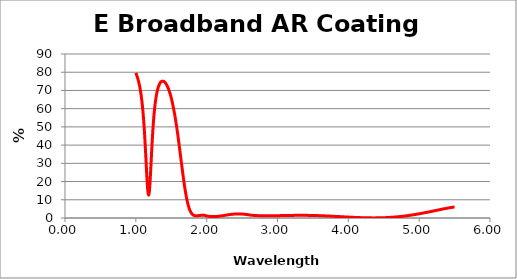
| Category | % Reflectance |
|---|---|
| 1.0 | 79.653 |
| 1.01 | 78.657 |
| 1.02 | 77.485 |
| 1.03 | 76.175 |
| 1.04 | 74.678 |
| 1.05 | 72.986 |
| 1.06 | 71.047 |
| 1.07 | 68.699 |
| 1.08 | 65.851 |
| 1.09 | 62.562 |
| 1.1 | 58.677 |
| 1.11 | 53.922 |
| 1.12 | 48.224 |
| 1.13 | 41.711 |
| 1.14 | 34.492 |
| 1.15 | 26.817 |
| 1.16 | 19.688 |
| 1.17 | 14.561 |
| 1.18 | 12.553 |
| 1.19 | 14.259 |
| 1.2 | 19.355 |
| 1.21 | 26.324 |
| 1.22 | 33.88 |
| 1.23 | 41.33 |
| 1.24 | 48.011 |
| 1.25 | 53.501 |
| 1.26 | 57.996 |
| 1.27 | 61.789 |
| 1.28 | 64.864 |
| 1.29 | 67.294 |
| 1.3 | 69.262 |
| 1.31 | 70.872 |
| 1.32 | 72.177 |
| 1.33 | 73.156 |
| 1.34 | 73.915 |
| 1.35 | 74.528 |
| 1.36 | 74.879 |
| 1.37 | 75.066 |
| 1.38 | 75.109 |
| 1.39 | 75.038 |
| 1.4 | 74.818 |
| 1.41 | 74.485 |
| 1.42 | 73.993 |
| 1.43 | 73.386 |
| 1.44 | 72.67 |
| 1.45 | 71.869 |
| 1.46 | 70.949 |
| 1.47 | 69.88 |
| 1.48 | 68.674 |
| 1.49 | 67.367 |
| 1.5 | 65.919 |
| 1.51 | 64.318 |
| 1.52 | 62.536 |
| 1.53 | 60.657 |
| 1.54 | 58.643 |
| 1.55 | 56.442 |
| 1.56 | 54.102 |
| 1.57 | 51.677 |
| 1.58 | 49.114 |
| 1.59 | 46.339 |
| 1.6 | 43.442 |
| 1.61 | 40.507 |
| 1.62 | 37.537 |
| 1.63 | 34.468 |
| 1.64 | 31.357 |
| 1.65 | 28.348 |
| 1.66 | 25.364 |
| 1.67 | 22.424 |
| 1.68 | 19.594 |
| 1.69 | 16.968 |
| 1.7 | 14.552 |
| 1.71 | 12.301 |
| 1.72 | 10.273 |
| 1.73 | 8.523 |
| 1.74 | 6.99 |
| 1.75 | 5.687 |
| 1.76 | 4.561 |
| 1.77 | 3.661 |
| 1.78 | 2.944 |
| 1.79 | 2.389 |
| 1.8 | 1.968 |
| 1.81 | 1.66 |
| 1.82 | 1.428 |
| 1.83 | 1.306 |
| 1.84 | 1.231 |
| 1.85 | 1.19 |
| 1.86 | 1.192 |
| 1.87 | 1.215 |
| 1.88 | 1.266 |
| 1.89 | 1.31 |
| 1.9 | 1.377 |
| 1.91 | 1.423 |
| 1.92 | 1.452 |
| 1.93 | 1.46 |
| 1.94 | 1.492 |
| 1.95 | 1.529 |
| 1.96 | 1.54 |
| 1.97 | 1.444 |
| 1.98 | 1.346 |
| 1.99 | 1.24 |
| 2.00007 | 1.158 |
| 2.00994 | 1.072 |
| 2.01982 | 0.997 |
| 2.02997 | 0.931 |
| 2.03984 | 0.878 |
| 2.04998 | 0.834 |
| 2.05984 | 0.8 |
| 2.0697 | 0.776 |
| 2.07984 | 0.76 |
| 2.08969 | 0.754 |
| 2.09982 | 0.755 |
| 2.10967 | 0.764 |
| 2.11979 | 0.78 |
| 2.12963 | 0.803 |
| 2.13947 | 0.832 |
| 2.14958 | 0.867 |
| 2.15941 | 0.907 |
| 2.16952 | 0.952 |
| 2.17962 | 1.002 |
| 2.18944 | 1.054 |
| 2.19954 | 1.111 |
| 2.20935 | 1.169 |
| 2.21944 | 1.23 |
| 2.22925 | 1.292 |
| 2.23933 | 1.356 |
| 2.24941 | 1.421 |
| 2.25921 | 1.485 |
| 2.26928 | 1.55 |
| 2.27907 | 1.612 |
| 2.28914 | 1.676 |
| 2.2992 | 1.737 |
| 2.30926 | 1.797 |
| 2.31903 | 1.852 |
| 2.32908 | 1.906 |
| 2.33913 | 1.957 |
| 2.3489 | 2.004 |
| 2.35894 | 2.048 |
| 2.36897 | 2.088 |
| 2.379 | 2.123 |
| 2.38875 | 2.153 |
| 2.39878 | 2.18 |
| 2.4088 | 2.201 |
| 2.41882 | 2.218 |
| 2.42883 | 2.229 |
| 2.43884 | 2.236 |
| 2.44885 | 2.237 |
| 2.45857 | 2.233 |
| 2.46857 | 2.224 |
| 2.47857 | 2.21 |
| 2.48856 | 2.192 |
| 2.49854 | 2.168 |
| 2.50853 | 2.141 |
| 2.51851 | 2.109 |
| 2.52848 | 2.073 |
| 2.53845 | 2.035 |
| 2.54842 | 1.993 |
| 2.55838 | 1.949 |
| 2.56834 | 1.903 |
| 2.57829 | 1.856 |
| 2.58825 | 1.808 |
| 2.59819 | 1.76 |
| 2.60813 | 1.62 |
| 2.61835 | 1.579 |
| 2.62828 | 1.542 |
| 2.63821 | 1.507 |
| 2.64814 | 1.475 |
| 2.65806 | 1.444 |
| 2.66798 | 1.416 |
| 2.67817 | 1.39 |
| 2.68808 | 1.366 |
| 2.69798 | 1.344 |
| 2.70788 | 1.324 |
| 2.71805 | 1.306 |
| 2.72794 | 1.289 |
| 2.73783 | 1.274 |
| 2.74799 | 1.261 |
| 2.75787 | 1.249 |
| 2.76774 | 1.239 |
| 2.77788 | 1.23 |
| 2.78775 | 1.222 |
| 2.79761 | 1.216 |
| 2.80774 | 1.211 |
| 2.81759 | 1.207 |
| 2.82771 | 1.204 |
| 2.83756 | 1.202 |
| 2.84767 | 1.201 |
| 2.8575 | 1.201 |
| 2.8676 | 1.202 |
| 2.87743 | 1.203 |
| 2.88752 | 1.206 |
| 2.89734 | 1.209 |
| 2.90742 | 1.213 |
| 2.9175 | 1.217 |
| 2.9273 | 1.222 |
| 2.93737 | 1.227 |
| 2.94716 | 1.233 |
| 2.95722 | 1.239 |
| 2.96728 | 1.246 |
| 2.97732 | 1.253 |
| 2.9871 | 1.26 |
| 2.99714 | 1.268 |
| 3.00717 | 1.276 |
| 3.0172 | 1.284 |
| 3.02695 | 1.292 |
| 3.03697 | 1.3 |
| 3.04699 | 1.308 |
| 3.057 | 1.316 |
| 3.067 | 1.325 |
| 3.077 | 1.333 |
| 3.087 | 1.341 |
| 3.09698 | 1.35 |
| 3.10697 | 1.358 |
| 3.11668 | 1.365 |
| 3.12665 | 1.373 |
| 3.13662 | 1.381 |
| 3.14685 | 1.388 |
| 3.15681 | 1.395 |
| 3.16676 | 1.402 |
| 3.17671 | 1.409 |
| 3.18665 | 1.415 |
| 3.19659 | 1.421 |
| 3.20652 | 1.427 |
| 3.21644 | 1.432 |
| 3.22636 | 1.437 |
| 3.23655 | 1.441 |
| 3.24646 | 1.445 |
| 3.25636 | 1.449 |
| 3.26626 | 1.452 |
| 3.27642 | 1.455 |
| 3.28631 | 1.458 |
| 3.29619 | 1.46 |
| 3.30633 | 1.461 |
| 3.3162 | 1.462 |
| 3.32633 | 1.463 |
| 3.33619 | 1.463 |
| 3.34605 | 1.462 |
| 3.35616 | 1.461 |
| 3.36601 | 1.46 |
| 3.37611 | 1.458 |
| 3.38594 | 1.455 |
| 3.39603 | 1.452 |
| 3.40585 | 1.448 |
| 3.41593 | 1.444 |
| 3.426 | 1.44 |
| 3.43581 | 1.434 |
| 3.44587 | 1.429 |
| 3.45592 | 1.422 |
| 3.46571 | 1.416 |
| 3.47575 | 1.408 |
| 3.48579 | 1.4 |
| 3.49582 | 1.392 |
| 3.50558 | 1.383 |
| 3.5156 | 1.374 |
| 3.52561 | 1.364 |
| 3.53562 | 1.353 |
| 3.54562 | 1.342 |
| 3.55561 | 1.331 |
| 3.5656 | 1.319 |
| 3.57558 | 1.306 |
| 3.58556 | 1.293 |
| 3.59553 | 1.28 |
| 3.60549 | 1.266 |
| 3.61545 | 1.252 |
| 3.6254 | 1.237 |
| 3.63534 | 1.222 |
| 3.64528 | 1.207 |
| 3.65521 | 1.191 |
| 3.66513 | 1.175 |
| 3.67531 | 1.158 |
| 3.68522 | 1.141 |
| 3.69513 | 1.123 |
| 3.70503 | 1.106 |
| 3.71518 | 1.087 |
| 3.72506 | 1.069 |
| 3.73494 | 1.051 |
| 3.74507 | 1.031 |
| 3.75494 | 1.012 |
| 3.76506 | 0.993 |
| 3.77491 | 0.973 |
| 3.78501 | 0.953 |
| 3.79485 | 0.933 |
| 3.80494 | 0.913 |
| 3.81477 | 0.892 |
| 3.82484 | 0.872 |
| 3.83465 | 0.851 |
| 3.84472 | 0.83 |
| 3.85477 | 0.809 |
| 3.86456 | 0.788 |
| 3.8746 | 0.767 |
| 3.88464 | 0.746 |
| 3.89466 | 0.724 |
| 3.90468 | 0.703 |
| 3.91444 | 0.682 |
| 3.92444 | 0.661 |
| 3.93444 | 0.64 |
| 3.94443 | 0.619 |
| 3.95442 | 0.598 |
| 3.96439 | 0.577 |
| 3.97436 | 0.556 |
| 3.98432 | 0.536 |
| 3.99428 | 0.515 |
| 4.00422 | 0.495 |
| 4.01416 | 0.475 |
| 4.02409 | 0.456 |
| 4.03427 | 0.436 |
| 4.04419 | 0.417 |
| 4.0541 | 0.398 |
| 4.064 | 0.379 |
| 4.07415 | 0.361 |
| 4.08403 | 0.343 |
| 4.09391 | 0.326 |
| 4.10404 | 0.308 |
| 4.1139 | 0.292 |
| 4.12401 | 0.275 |
| 4.13385 | 0.259 |
| 4.14395 | 0.244 |
| 4.15378 | 0.229 |
| 4.16386 | 0.215 |
| 4.17367 | 0.201 |
| 4.18373 | 0.188 |
| 4.19378 | 0.175 |
| 4.20383 | 0.163 |
| 4.21361 | 0.151 |
| 4.22364 | 0.141 |
| 4.23366 | 0.13 |
| 4.24367 | 0.121 |
| 4.25367 | 0.112 |
| 4.26342 | 0.104 |
| 4.27341 | 0.097 |
| 4.28338 | 0.09 |
| 4.29335 | 0.084 |
| 4.30332 | 0.079 |
| 4.31327 | 0.075 |
| 4.32346 | 0.071 |
| 4.3334 | 0.068 |
| 4.34333 | 0.067 |
| 4.35325 | 0.066 |
| 4.36316 | 0.066 |
| 4.37331 | 0.067 |
| 4.3832 | 0.068 |
| 4.39308 | 0.071 |
| 4.40321 | 0.075 |
| 4.41308 | 0.079 |
| 4.42318 | 0.085 |
| 4.43303 | 0.092 |
| 4.44312 | 0.099 |
| 4.45295 | 0.108 |
| 4.46302 | 0.118 |
| 4.47283 | 0.128 |
| 4.48289 | 0.14 |
| 4.49293 | 0.153 |
| 4.50296 | 0.167 |
| 4.51274 | 0.181 |
| 4.52276 | 0.198 |
| 4.53276 | 0.215 |
| 4.54276 | 0.233 |
| 4.55274 | 0.253 |
| 4.56272 | 0.273 |
| 4.57269 | 0.295 |
| 4.58265 | 0.318 |
| 4.5926 | 0.342 |
| 4.60254 | 0.367 |
| 4.61247 | 0.393 |
| 4.62239 | 0.42 |
| 4.63254 | 0.449 |
| 4.64244 | 0.479 |
| 4.65234 | 0.51 |
| 4.66246 | 0.543 |
| 4.67233 | 0.576 |
| 4.68244 | 0.611 |
| 4.69229 | 0.646 |
| 4.70238 | 0.684 |
| 4.71221 | 0.721 |
| 4.72227 | 0.761 |
| 4.73209 | 0.801 |
| 4.74213 | 0.843 |
| 4.75217 | 0.886 |
| 4.76219 | 0.931 |
| 4.77197 | 0.975 |
| 4.78197 | 1.022 |
| 4.79196 | 1.07 |
| 4.80195 | 1.118 |
| 4.81192 | 1.168 |
| 4.82188 | 1.22 |
| 4.83183 | 1.272 |
| 4.84177 | 1.325 |
| 4.85194 | 1.38 |
| 4.86186 | 1.436 |
| 4.87177 | 1.492 |
| 4.88167 | 1.549 |
| 4.89179 | 1.609 |
| 4.90167 | 1.669 |
| 4.91177 | 1.73 |
| 4.92163 | 1.792 |
| 4.93171 | 1.855 |
| 4.94155 | 1.918 |
| 4.95161 | 1.984 |
| 4.96165 | 2.05 |
| 4.97146 | 2.116 |
| 4.98148 | 2.184 |
| 4.9915 | 2.253 |
| 5.00173 | 2.324 |
| 5.01155 | 2.393 |
| 5.02137 | 2.463 |
| 5.03119 | 2.534 |
| 5.04101 | 2.606 |
| 5.05158 | 2.684 |
| 5.06139 | 2.756 |
| 5.07121 | 2.83 |
| 5.08102 | 2.904 |
| 5.09083 | 2.979 |
| 5.10139 | 3.06 |
| 5.1112 | 3.136 |
| 5.12101 | 3.212 |
| 5.13082 | 3.289 |
| 5.14138 | 3.372 |
| 5.15118 | 3.45 |
| 5.16099 | 3.528 |
| 5.17079 | 3.606 |
| 5.18059 | 3.684 |
| 5.19115 | 3.769 |
| 5.20095 | 3.848 |
| 5.21074 | 3.927 |
| 5.22054 | 4.006 |
| 5.23109 | 4.091 |
| 5.24089 | 4.17 |
| 5.25068 | 4.249 |
| 5.26047 | 4.328 |
| 5.27102 | 4.413 |
| 5.28081 | 4.491 |
| 5.2906 | 4.569 |
| 5.30039 | 4.647 |
| 5.31017 | 4.725 |
| 5.32071 | 4.808 |
| 5.3305 | 4.884 |
| 5.34028 | 4.96 |
| 5.35007 | 5.036 |
| 5.3606 | 5.116 |
| 5.37038 | 5.19 |
| 5.38016 | 5.263 |
| 5.38994 | 5.335 |
| 5.40047 | 5.412 |
| 5.41024 | 5.482 |
| 5.42002 | 5.551 |
| 5.43054 | 5.624 |
| 5.44032 | 5.691 |
| 5.45009 | 5.757 |
| 5.45986 | 5.821 |
| 5.47038 | 5.888 |
| 5.48015 | 5.949 |
| 5.48991 | 6.008 |
| 5.49968 | 6.066 |